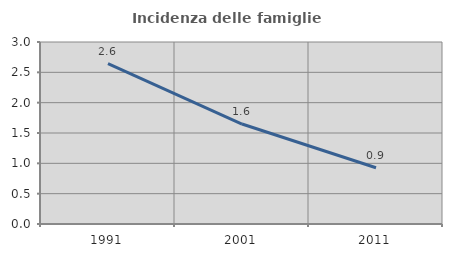
| Category | Incidenza delle famiglie numerose |
|---|---|
| 1991.0 | 2.643 |
| 2001.0 | 1.648 |
| 2011.0 | 0.928 |